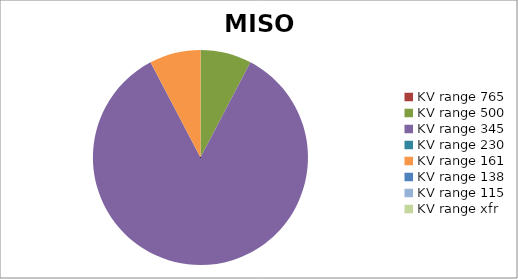
| Category | MISO |
|---|---|
| 0 | 0 |
| 1 | 1 |
| 2 | 11 |
| 3 | 0 |
| 4 | 1 |
| 5 | 0 |
| 6 | 0 |
| 7 | 0 |